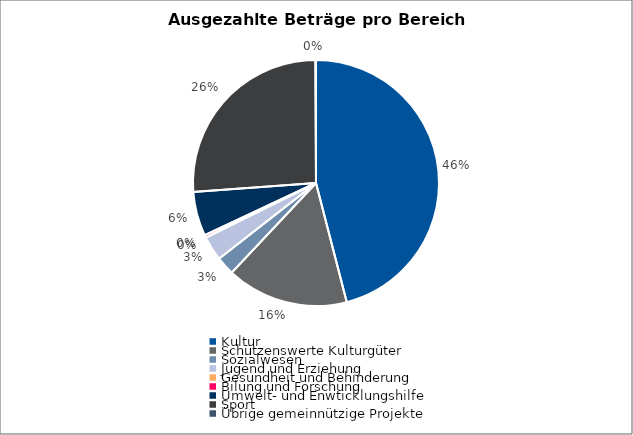
| Category | Series 0 |
|---|---|
| Kultur | 6015910 |
| Schützenswerte Kulturgüter | 2097052 |
| Sozialwesen | 319000 |
| Jugend und Erziehung | 421732.188 |
| Gesundheit und Behinderung | 0 |
| Bilung und Forschung | 44535 |
| Umwelt- und Enwticklungshilfe | 763228.4 |
| Sport | 3411760.75 |
| Übrige gemeinnützige Projekte | 10300 |